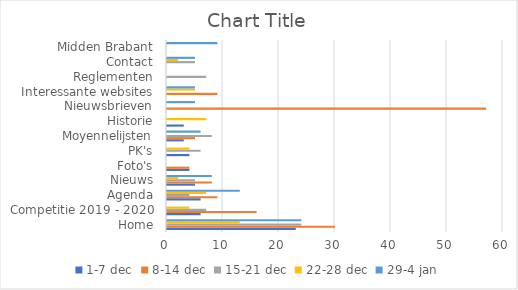
| Category | 1-7 dec | 8-14 dec | 15-21 dec | 22-28 dec | 29-4 jan |
|---|---|---|---|---|---|
| Home | 23 | 30 | 24 | 13 | 24 |
| Competitie 2019 - 2020 | 6 | 16 | 7 | 4 | 0 |
| Agenda | 6 | 9 | 4 | 7 | 13 |
| Nieuws | 5 | 8 | 5 | 2 | 8 |
| Foto's | 4 | 4 | 0 | 0 | 0 |
| PK's | 4 | 0 | 6 | 4 | 0 |
| Moyennelijsten | 3 | 5 | 8 | 0 | 6 |
| Historie | 3 | 0 | 0 | 7 | 0 |
| Nieuwsbrieven | 0 | 57 | 0 | 0 | 5 |
| Interessante websites | 0 | 9 | 0 | 5 | 5 |
| Reglementen | 0 | 0 | 7 | 0 | 0 |
| Contact | 0 | 0 | 5 | 2 | 5 |
| Midden Brabant | 0 | 0 | 0 | 0 | 9 |